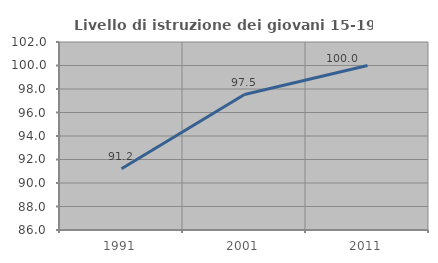
| Category | Livello di istruzione dei giovani 15-19 anni |
|---|---|
| 1991.0 | 91.209 |
| 2001.0 | 97.531 |
| 2011.0 | 100 |